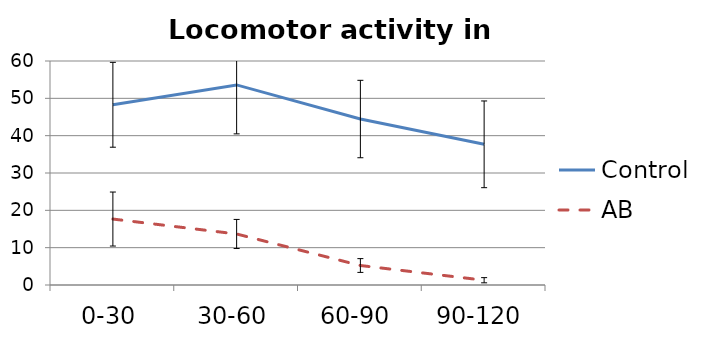
| Category | Control | AB |
|---|---|---|
| 0-30 | 48.273 | 17.667 |
| 30-60 | 53.591 | 13.667 |
| 60-90 | 44.455 | 5.222 |
| 90-120 | 37.682 | 1.278 |